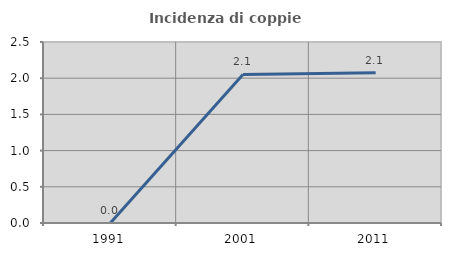
| Category | Incidenza di coppie miste |
|---|---|
| 1991.0 | 0 |
| 2001.0 | 2.051 |
| 2011.0 | 2.075 |